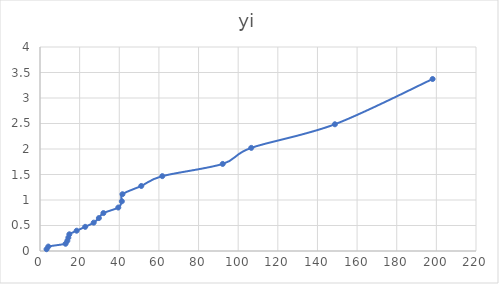
| Category | yi |
|---|---|
| 3.3 | 0.035 |
| 4.2 | 0.087 |
| 12.9 | 0.142 |
| 13.8 | 0.2 |
| 14.3 | 0.262 |
| 14.8 | 0.328 |
| 18.5 | 0.398 |
| 22.8 | 0.474 |
| 27.1 | 0.556 |
| 29.7 | 0.645 |
| 32.0 | 0.743 |
| 39.5 | 0.852 |
| 41.3 | 0.974 |
| 41.6 | 1.113 |
| 51.1 | 1.275 |
| 61.7 | 1.468 |
| 92.2 | 1.707 |
| 106.6 | 2.022 |
| 148.8 | 2.485 |
| 198.1 | 3.372 |